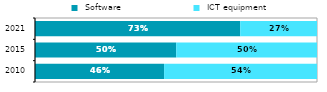
| Category |  Software |  ICT equipment |
|---|---|---|
| 2010.0 | 0.458 | 0.542 |
| 2015.0 | 0.501 | 0.499 |
| 2021.0 | 0.728 | 0.272 |